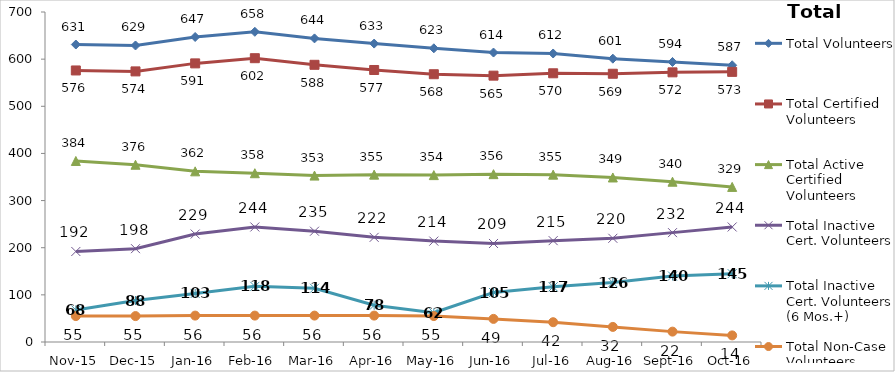
| Category | Total Volunteers | Total Certified Volunteers | Total Active Certified Volunteers | Total Inactive Cert. Volunteers | Total Inactive Cert. Volunteers (6 Mos.+) | Total Non-Case Volunteers |
|---|---|---|---|---|---|---|
| Nov-15 | 631 | 576 | 384 | 192 | 68 | 55 |
| Dec-15 | 629 | 574 | 376 | 198 | 88 | 55 |
| Jan-16 | 647 | 591 | 362 | 229 | 103 | 56 |
| Feb-16 | 658 | 602 | 358 | 244 | 118 | 56 |
| Mar-16 | 644 | 588 | 353 | 235 | 114 | 56 |
| Apr-16 | 633 | 577 | 355 | 222 | 78 | 56 |
| May-16 | 623 | 568 | 354 | 214 | 62 | 55 |
| Jun-16 | 614 | 565 | 356 | 209 | 105 | 49 |
| Jul-16 | 612 | 570 | 355 | 215 | 117 | 42 |
| Aug-16 | 601 | 569 | 349 | 220 | 126 | 32 |
| Sep-16 | 594 | 572 | 340 | 232 | 140 | 22 |
| Oct-16 | 587 | 573 | 329 | 244 | 145 | 14 |